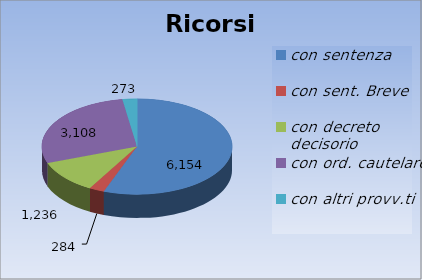
| Category | Ricorsi definiti |
|---|---|
| con sentenza | 6154 |
| con sent. Breve | 284 |
| con decreto decisorio | 1236 |
| con ord. cautelare | 3108 |
| con altri provv.ti | 273 |